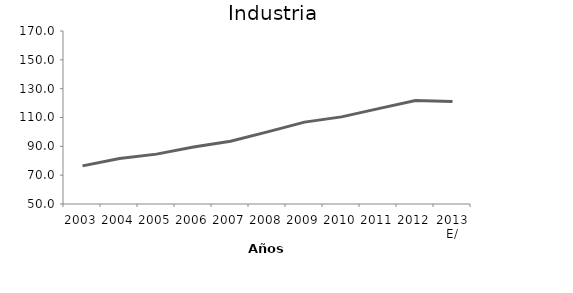
| Category | Industria |
|---|---|
| 2003 | 76.44 |
| 2004 | 81.61 |
| 2005 | 84.595 |
| 2006 | 89.549 |
| 2007 | 93.515 |
| 2008 | 100 |
| 2009 | 106.792 |
| 2010 | 110.435 |
| 2011 | 116.144 |
| 2012 | 121.786 |
| 2013 E/ | 121.015 |